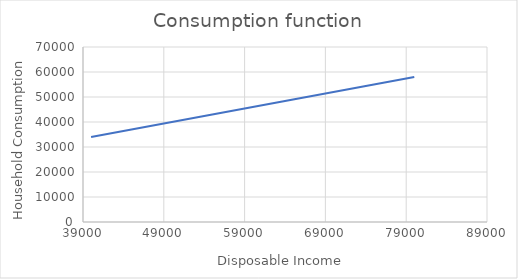
| Category | Series 0 |
|---|---|
| 40000.0 | 34000 |
| 45000.0 | 37000 |
| 50000.0 | 40000 |
| 55000.0 | 43000 |
| 60000.0 | 46000 |
| 65000.0 | 49000 |
| 70000.0 | 52000 |
| 75000.0 | 55000 |
| 80000.0 | 58000 |